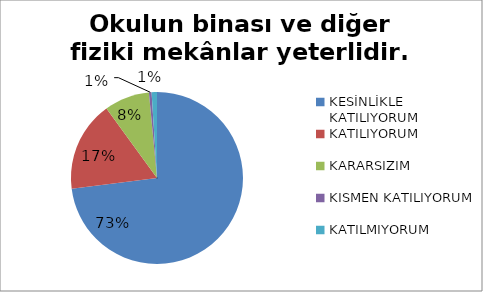
| Category | Okulun binası ve diğer fiziki mekânlar yeterlidir. |
|---|---|
| KESİNLİKLE KATILIYORUM | 146 |
| KATILIYORUM | 34 |
| KARARSIZIM | 17 |
| KISMEN KATILIYORUM | 1 |
| KATILMIYORUM | 2 |